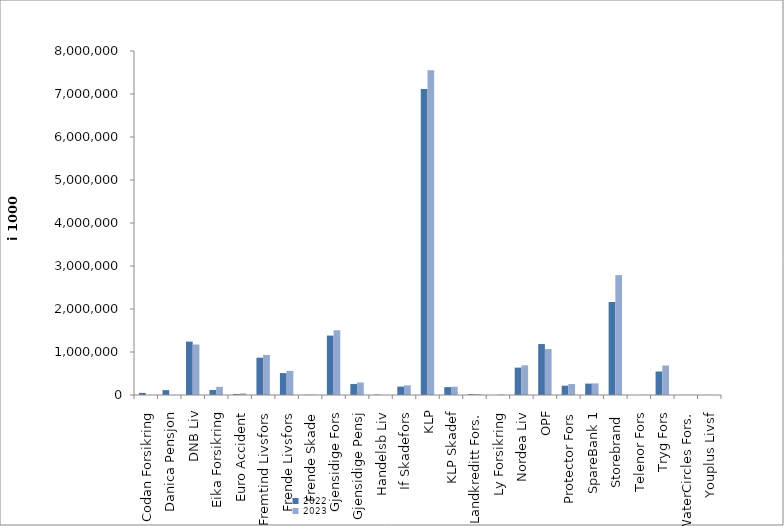
| Category | 2022 | 2023 |
|---|---|---|
| Codan Forsikring | 49378 | 0 |
| Danica Pensjon | 112892.864 | 0 |
| DNB Liv | 1241691.27 | 1174839.712 |
| Eika Forsikring | 116603 | 189579 |
| Euro Accident | 22472 | 36616 |
| Fremtind Livsfors | 867620.148 | 931757.563 |
| Frende Livsfors | 509672 | 561739 |
| Frende Skade | 6055.442 | 6113.049 |
| Gjensidige Fors | 1381871.285 | 1505481.132 |
| Gjensidige Pensj | 254783 | 291293 |
| Handelsb Liv | 8764.519 | 0 |
| If Skadefors | 195617.654 | 224595.872 |
| KLP | 7118708.535 | 7553784.431 |
| KLP Skadef | 182893.262 | 193468.312 |
| Landkreditt Fors. | 18594 | 20027 |
| Ly Forsikring | 0 | 12079 |
| Nordea Liv | 636134.252 | 690329.5 |
| OPF | 1184750 | 1068666.478 |
| Protector Fors | 216669.421 | 255125.81 |
| SpareBank 1 | 264029.163 | 269626.87 |
| Storebrand  | 2162321.175 | 2787293.238 |
| Telenor Fors | 319 | 1972 |
| Tryg Fors | 546669.5 | 685373.375 |
| WaterCircles Fors. | 2114 | 2003 |
| Youplus Livsf | 868 | 1558 |